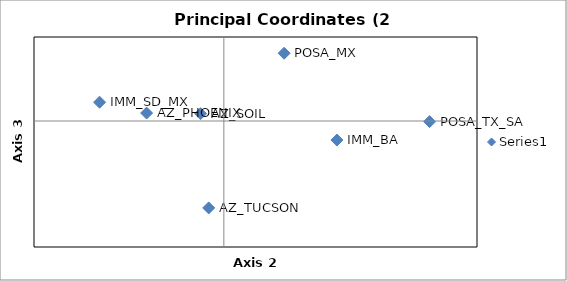
| Category | Series 0 |
|---|---|
| -0.06103933713086536 | 0.009 |
| -0.018424567291551973 | 0.009 |
| -0.011965267660352878 | -0.103 |
| 0.08934912889617086 | -0.023 |
| -0.09820842257316631 | 0.022 |
| 0.047619526383110795 | 0.081 |
| 0.16253935941946887 | -0.001 |